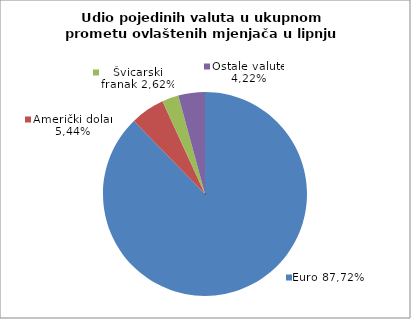
| Category | EUR |
|---|---|
| 0 | 87.721 |
| 1 | 5.439 |
| 2 | 2.619 |
| 3 | 4.221 |